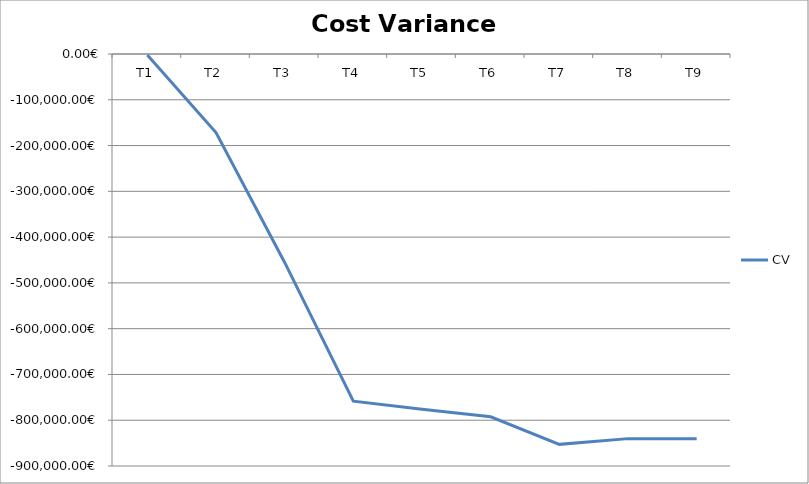
| Category | CV |
|---|---|
| T1 | -2179.2 |
| T2 | -171596.221 |
| T3 | -455300.059 |
| T4 | -758493.271 |
| T5 | -776097.255 |
| T6 | -792479.712 |
| T7 | -852734.593 |
| T8 | -840204.193 |
| T9 | -840204.193 |